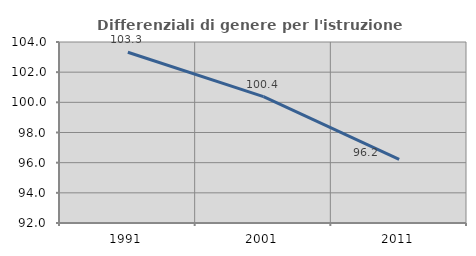
| Category | Differenziali di genere per l'istruzione superiore |
|---|---|
| 1991.0 | 103.324 |
| 2001.0 | 100.379 |
| 2011.0 | 96.22 |